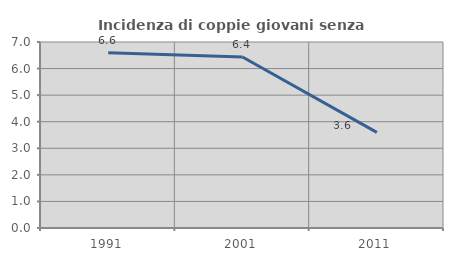
| Category | Incidenza di coppie giovani senza figli |
|---|---|
| 1991.0 | 6.596 |
| 2001.0 | 6.436 |
| 2011.0 | 3.601 |